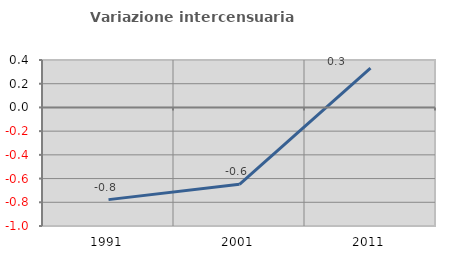
| Category | Variazione intercensuaria annua |
|---|---|
| 1991.0 | -0.777 |
| 2001.0 | -0.649 |
| 2011.0 | 0.332 |